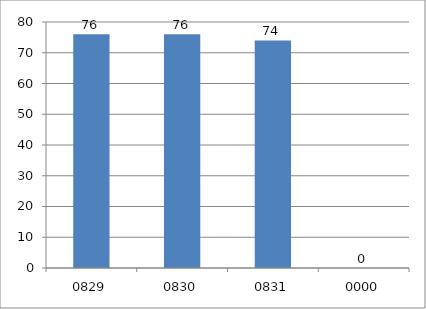
| Category | Series 0 |
|---|---|
| 829.0 | 76 |
| 830.0 | 76 |
| 831.0 | 74 |
| 0.0 | 0 |